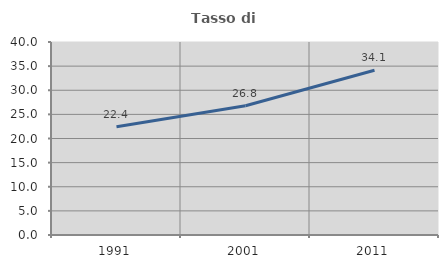
| Category | Tasso di occupazione   |
|---|---|
| 1991.0 | 22.425 |
| 2001.0 | 26.783 |
| 2011.0 | 34.134 |